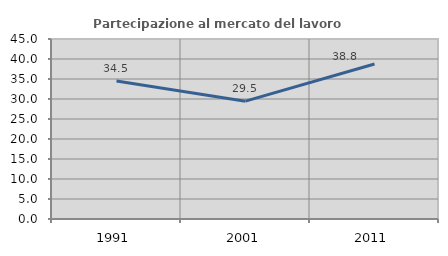
| Category | Partecipazione al mercato del lavoro  femminile |
|---|---|
| 1991.0 | 34.523 |
| 2001.0 | 29.46 |
| 2011.0 | 38.759 |